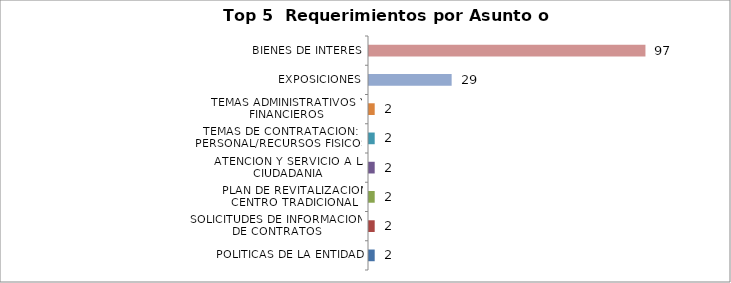
| Category | Total |
|---|---|
| POLITICAS DE LA ENTIDAD | 2 |
| SOLICITUDES DE INFORMACION DE CONTRATOS | 2 |
| PLAN DE REVITALIZACION CENTRO TRADICIONAL | 2 |
| ATENCION Y SERVICIO A LA CIUDADANIA | 2 |
| TEMAS DE CONTRATACION: PERSONAL/RECURSOS FISICOS | 2 |
| TEMAS ADMINISTRATIVOS Y FINANCIEROS | 2 |
| EXPOSICIONES | 29 |
| BIENES DE INTERES | 97 |